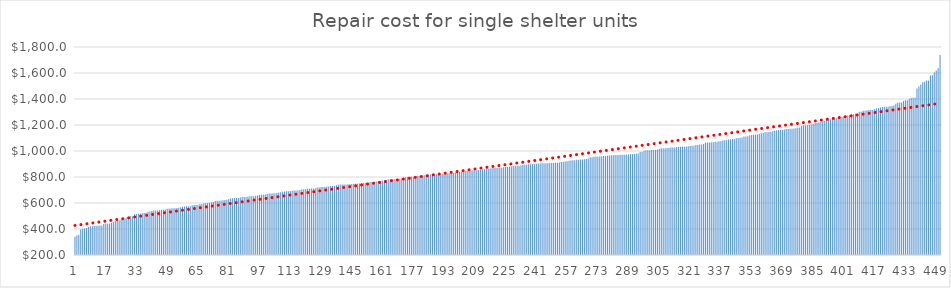
| Category | Series 0 |
|---|---|
| 0 | 340.35 |
| 1 | 349.7 |
| 2 | 355.8 |
| 3 | 396.9 |
| 4 | 401.5 |
| 5 | 403.2 |
| 6 | 408 |
| 7 | 414.55 |
| 8 | 421 |
| 9 | 421.55 |
| 10 | 423.1 |
| 11 | 424.1 |
| 12 | 425 |
| 13 | 426.3 |
| 14 | 427.2 |
| 15 | 438.4 |
| 16 | 439.8 |
| 17 | 441.1 |
| 18 | 441.85 |
| 19 | 447.8 |
| 20 | 451.75 |
| 21 | 462.3 |
| 22 | 466.9 |
| 23 | 468.2 |
| 24 | 473.2 |
| 25 | 479.05 |
| 26 | 481.6 |
| 27 | 489.3 |
| 28 | 490.1 |
| 29 | 498.1 |
| 30 | 498.95 |
| 31 | 512.8 |
| 32 | 514 |
| 33 | 518.08 |
| 34 | 518.6 |
| 35 | 520.6 |
| 36 | 523 |
| 37 | 524.178 |
| 38 | 532.35 |
| 39 | 535.4 |
| 40 | 537.9 |
| 41 | 541.8 |
| 42 | 542.4 |
| 43 | 543 |
| 44 | 545 |
| 45 | 548.1 |
| 46 | 548.2 |
| 47 | 550.3 |
| 48 | 555.6 |
| 49 | 557.5 |
| 50 | 557.6 |
| 51 | 559.4 |
| 52 | 560.4 |
| 53 | 562.1 |
| 54 | 563.9 |
| 55 | 567.4 |
| 56 | 571.8 |
| 57 | 572.3 |
| 58 | 574.9 |
| 59 | 575 |
| 60 | 575.2 |
| 61 | 583.4 |
| 62 | 584.9 |
| 63 | 585.4 |
| 64 | 587 |
| 65 | 590.4 |
| 66 | 591.4 |
| 67 | 598.3 |
| 68 | 598.48 |
| 69 | 600.6 |
| 70 | 601.85 |
| 71 | 605.3 |
| 72 | 607.6 |
| 73 | 615.55 |
| 74 | 616.9 |
| 75 | 617.35 |
| 76 | 619.4 |
| 77 | 621.4 |
| 78 | 622.9 |
| 79 | 625.65 |
| 80 | 631.05 |
| 81 | 634.4 |
| 82 | 635.6 |
| 83 | 637.9 |
| 84 | 638.18 |
| 85 | 638.8 |
| 86 | 641.7 |
| 87 | 645.25 |
| 88 | 646 |
| 89 | 646.3 |
| 90 | 650.1 |
| 91 | 651.52 |
| 92 | 651.6 |
| 93 | 651.904 |
| 94 | 655.4 |
| 95 | 658 |
| 96 | 663.35 |
| 97 | 663.5 |
| 98 | 664.2 |
| 99 | 664.7 |
| 100 | 669.9 |
| 101 | 673 |
| 102 | 673.28 |
| 103 | 675.6 |
| 104 | 675.6 |
| 105 | 676.2 |
| 106 | 679.9 |
| 107 | 683.5 |
| 108 | 686.6 |
| 109 | 688.45 |
| 110 | 689.7 |
| 111 | 690.3 |
| 112 | 693 |
| 113 | 694.54 |
| 114 | 696.6 |
| 115 | 696.7 |
| 116 | 696.8 |
| 117 | 700.9 |
| 118 | 705.6 |
| 119 | 706.6 |
| 120 | 707.4 |
| 121 | 710.4 |
| 122 | 710.6 |
| 123 | 711.05 |
| 124 | 711.6 |
| 125 | 713.6 |
| 126 | 719.2 |
| 127 | 722 |
| 128 | 722.4 |
| 129 | 723.5 |
| 130 | 723.9 |
| 131 | 726 |
| 132 | 726.8 |
| 133 | 730.9 |
| 134 | 731 |
| 135 | 731.1 |
| 136 | 735.6 |
| 137 | 739.5 |
| 138 | 741.6 |
| 139 | 741.8 |
| 140 | 741.95 |
| 141 | 742.5 |
| 142 | 743.3 |
| 143 | 744.7 |
| 144 | 746.7 |
| 145 | 747.45 |
| 146 | 747.65 |
| 147 | 748.6 |
| 148 | 750.35 |
| 149 | 751.8 |
| 150 | 754.25 |
| 151 | 756.35 |
| 152 | 756.8 |
| 153 | 760.5 |
| 154 | 761.4 |
| 155 | 762 |
| 156 | 762.58 |
| 157 | 764.55 |
| 158 | 767.8 |
| 159 | 770 |
| 160 | 772.25 |
| 161 | 775.85 |
| 162 | 776.85 |
| 163 | 780.068 |
| 164 | 781.85 |
| 165 | 783 |
| 166 | 784.75 |
| 167 | 784.8 |
| 168 | 785.55 |
| 169 | 787 |
| 170 | 791.05 |
| 171 | 794.1 |
| 172 | 798.8 |
| 173 | 799.45 |
| 174 | 799.9 |
| 175 | 801.9 |
| 176 | 802.2 |
| 177 | 805.75 |
| 178 | 809.05 |
| 179 | 809.05 |
| 180 | 810.6 |
| 181 | 811.32 |
| 182 | 813.3 |
| 183 | 814.98 |
| 184 | 816.7 |
| 185 | 819.85 |
| 186 | 820.4 |
| 187 | 820.8 |
| 188 | 821 |
| 189 | 821.8 |
| 190 | 824.45 |
| 191 | 824.9 |
| 192 | 826.4 |
| 193 | 828.6 |
| 194 | 828.9 |
| 195 | 828.95 |
| 196 | 830.3 |
| 197 | 830.55 |
| 198 | 835.15 |
| 199 | 835.35 |
| 200 | 839.7 |
| 201 | 840.4 |
| 202 | 840.9 |
| 203 | 845.2 |
| 204 | 846.07 |
| 205 | 848.18 |
| 206 | 849.45 |
| 207 | 851.4 |
| 208 | 851.45 |
| 209 | 851.7 |
| 210 | 852.9 |
| 211 | 855.9 |
| 212 | 857.65 |
| 213 | 860.35 |
| 214 | 862.8 |
| 215 | 864.2 |
| 216 | 865.69 |
| 217 | 868.2 |
| 218 | 868.7 |
| 219 | 869 |
| 220 | 870 |
| 221 | 870.2 |
| 222 | 871.8 |
| 223 | 874.9 |
| 224 | 876.1 |
| 225 | 878.64 |
| 226 | 878.7 |
| 227 | 880.1 |
| 228 | 883.85 |
| 229 | 885.8 |
| 230 | 885.8 |
| 231 | 886.3 |
| 232 | 890.6 |
| 233 | 892.35 |
| 234 | 893.82 |
| 235 | 894.5 |
| 236 | 898.1 |
| 237 | 898.2 |
| 238 | 898.65 |
| 239 | 898.8 |
| 240 | 901.06 |
| 241 | 903.15 |
| 242 | 903.5 |
| 243 | 905.1 |
| 244 | 906 |
| 245 | 906.5 |
| 246 | 906.6 |
| 247 | 907 |
| 248 | 907.6 |
| 249 | 908.4 |
| 250 | 908.9 |
| 251 | 909 |
| 252 | 910.6 |
| 253 | 915.59 |
| 254 | 916.5 |
| 255 | 918.3 |
| 256 | 920.4 |
| 257 | 924.3 |
| 258 | 927.45 |
| 259 | 928.4 |
| 260 | 929.15 |
| 261 | 933.56 |
| 262 | 933.6 |
| 263 | 933.9 |
| 264 | 934.2 |
| 265 | 937.35 |
| 266 | 938.4 |
| 267 | 943.2 |
| 268 | 951.9 |
| 269 | 952.8 |
| 270 | 954.95 |
| 271 | 957.3 |
| 272 | 957.45 |
| 273 | 958.05 |
| 274 | 959.05 |
| 275 | 961.3 |
| 276 | 962.4 |
| 277 | 964.1 |
| 278 | 965.1 |
| 279 | 967.35 |
| 280 | 968 |
| 281 | 968.8 |
| 282 | 969.4 |
| 283 | 969.7 |
| 284 | 970.3 |
| 285 | 970.4 |
| 286 | 970.7 |
| 287 | 972.4 |
| 288 | 973.6 |
| 289 | 975.7 |
| 290 | 975.9 |
| 291 | 977.8 |
| 292 | 980.4 |
| 293 | 981.1 |
| 294 | 991.65 |
| 295 | 992.4 |
| 296 | 1001.9 |
| 297 | 1003.9 |
| 298 | 1006 |
| 299 | 1006.1 |
| 300 | 1007.225 |
| 301 | 1007.3 |
| 302 | 1008.8 |
| 303 | 1010.9 |
| 304 | 1015.3 |
| 305 | 1020.7 |
| 306 | 1020.9 |
| 307 | 1021.2 |
| 308 | 1023.9 |
| 309 | 1024.8 |
| 310 | 1026.65 |
| 311 | 1026.9 |
| 312 | 1027.2 |
| 313 | 1030.95 |
| 314 | 1031 |
| 315 | 1031.6 |
| 316 | 1032.45 |
| 317 | 1033.6 |
| 318 | 1034.1 |
| 319 | 1037 |
| 320 | 1037.6 |
| 321 | 1039.68 |
| 322 | 1041 |
| 323 | 1045.25 |
| 324 | 1045.45 |
| 325 | 1049.668 |
| 326 | 1050.55 |
| 327 | 1054.1 |
| 328 | 1064.7 |
| 329 | 1065 |
| 330 | 1066.3 |
| 331 | 1066.9 |
| 332 | 1067.7 |
| 333 | 1070.9 |
| 334 | 1071 |
| 335 | 1074.2 |
| 336 | 1075.3 |
| 337 | 1080.2 |
| 338 | 1082.85 |
| 339 | 1083.12 |
| 340 | 1089.2 |
| 341 | 1089.695 |
| 342 | 1091.5 |
| 343 | 1092.9 |
| 344 | 1098.25 |
| 345 | 1099.5 |
| 346 | 1102.7 |
| 347 | 1103.3 |
| 348 | 1111.8 |
| 349 | 1111.8 |
| 350 | 1113 |
| 351 | 1122.1 |
| 352 | 1122.65 |
| 353 | 1125.3 |
| 354 | 1127.25 |
| 355 | 1127.5 |
| 356 | 1132.2 |
| 357 | 1136.8 |
| 358 | 1141.2 |
| 359 | 1143.6 |
| 360 | 1144 |
| 361 | 1145.3 |
| 362 | 1150.05 |
| 363 | 1151.4 |
| 364 | 1156.2 |
| 365 | 1159.4 |
| 366 | 1161.7 |
| 367 | 1162.9 |
| 368 | 1163.45 |
| 369 | 1166.05 |
| 370 | 1169.4 |
| 371 | 1169.6 |
| 372 | 1171.18 |
| 373 | 1171.6 |
| 374 | 1174 |
| 375 | 1174.231 |
| 376 | 1180.5 |
| 377 | 1180.9 |
| 378 | 1191.4 |
| 379 | 1196.95 |
| 380 | 1197.4 |
| 381 | 1197.75 |
| 382 | 1199.1 |
| 383 | 1203.05 |
| 384 | 1208.61 |
| 385 | 1215.1 |
| 386 | 1215.2 |
| 387 | 1219.2 |
| 388 | 1223.9 |
| 389 | 1226.95 |
| 390 | 1231.3 |
| 391 | 1237.75 |
| 392 | 1240 |
| 393 | 1242.2 |
| 394 | 1247.4 |
| 395 | 1248.05 |
| 396 | 1252.8 |
| 397 | 1254.63 |
| 398 | 1256.5 |
| 399 | 1262.3 |
| 400 | 1267.25 |
| 401 | 1267.4 |
| 402 | 1273 |
| 403 | 1277.8 |
| 404 | 1281.5 |
| 405 | 1282.6 |
| 406 | 1286.2 |
| 407 | 1289.25 |
| 408 | 1302.1 |
| 409 | 1302.48 |
| 410 | 1309.33 |
| 411 | 1310.2 |
| 412 | 1312.9 |
| 413 | 1313.45 |
| 414 | 1315.5 |
| 415 | 1318.1 |
| 416 | 1320.7 |
| 417 | 1328.6 |
| 418 | 1329.65 |
| 419 | 1334.55 |
| 420 | 1338.55 |
| 421 | 1340.4 |
| 422 | 1341 |
| 423 | 1341.2 |
| 424 | 1344.5 |
| 425 | 1346.55 |
| 426 | 1350.5 |
| 427 | 1363.2 |
| 428 | 1372.1 |
| 429 | 1372.59 |
| 430 | 1373.3 |
| 431 | 1385.7 |
| 432 | 1390.65 |
| 433 | 1391.14 |
| 434 | 1402.4 |
| 435 | 1408.3 |
| 436 | 1410.483 |
| 437 | 1412.4 |
| 438 | 1480.1 |
| 439 | 1496.6 |
| 440 | 1512.3 |
| 441 | 1528.4 |
| 442 | 1532.9 |
| 443 | 1541.4 |
| 444 | 1541.4 |
| 445 | 1580 |
| 446 | 1583 |
| 447 | 1603.75 |
| 448 | 1618.75 |
| 449 | 1637.25 |
| 450 | 1738.1 |